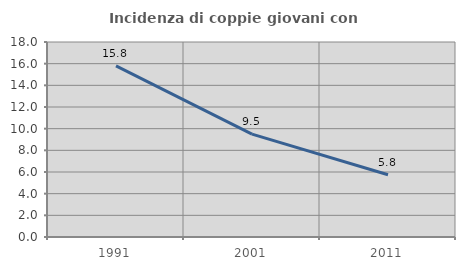
| Category | Incidenza di coppie giovani con figli |
|---|---|
| 1991.0 | 15.798 |
| 2001.0 | 9.495 |
| 2011.0 | 5.75 |